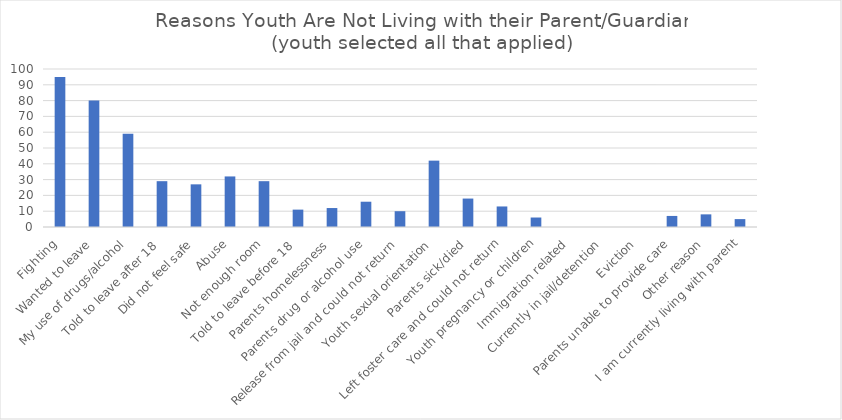
| Category | Series 0 |
|---|---|
| Fighting | 95 |
| Wanted to leave | 80 |
| My use of drugs/alcohol | 59 |
| Told to leave after 18 | 29 |
| Did not feel safe | 27 |
| Abuse | 32 |
| Not enough room | 29 |
| Told to leave before 18 | 11 |
| Parents homelessness | 12 |
| Parents drug or alcohol use | 16 |
| Release from jail and could not return | 10 |
| Youth sexual orientation | 42 |
| Parents sick/died | 18 |
| Left foster care and could not return | 13 |
| Youth pregnancy or children | 6 |
| Immigration related | 0 |
| Currently in jail/detention | 0 |
| Eviction | 0 |
| Parents unable to provide care | 7 |
| Other reason | 8 |
| I am currently living with parent | 5 |